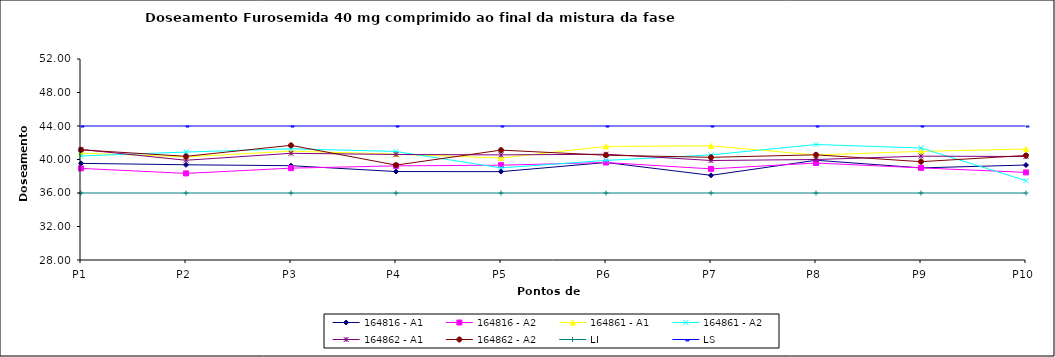
| Category | 164816 - A1 | 164816 - A2 | 164861 - A1 | 164861 - A2 | 164862 - A1 | 164862 - A2 | LI | LS |
|---|---|---|---|---|---|---|---|---|
| P1 | 39.54 | 38.94 | 40.76 | 40.42 | 41.2 | 41.15 | 36 | 44 |
| P2 | 39.37 | 38.34 | 40.31 | 40.89 | 39.91 | 40.38 | 36 | 44 |
| P3 | 39.26 | 38.97 | 41 | 41.28 | 40.74 | 41.69 | 36 | 44 |
| P4 | 38.56 | 39.24 | 40.64 | 40.96 | 40.6 | 39.33 | 36 | 44 |
| P5 | 38.55 | 39.32 | 40.18 | 39 | 40.55 | 41.12 | 36 | 44 |
| P6 | 39.64 | 39.64 | 41.56 | 39.89 | 40.63 | 40.51 | 36 | 44 |
| P7 | 38.11 | 38.88 | 41.63 | 40.55 | 39.88 | 40.26 | 36 | 44 |
| P8 | 39.91 | 39.58 | 40.54 | 41.79 | 40 | 40.56 | 36 | 44 |
| P9 | 39 | 39 | 40.97 | 41.37 | 40.4 | 39.74 | 36 | 44 |
| P10 | 39.34 | 38.46 | 41.25 | 37.47 | 40.36 | 40.48 | 36 | 44 |